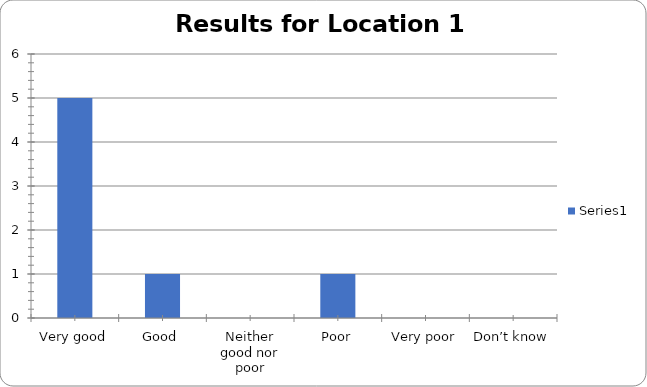
| Category | Series 0 |
|---|---|
| Very good | 5 |
| Good | 1 |
| Neither good nor poor | 0 |
| Poor | 1 |
| Very poor | 0 |
| Don’t know | 0 |